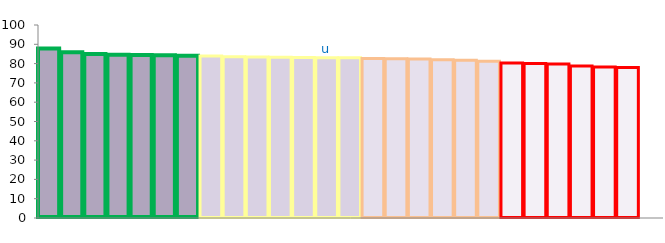
| Category | Top Quartile | 2nd Quartile | 3rd Quartile | Bottom Quartile | Series 4 |
|---|---|---|---|---|---|
|  | 87.875 | 0 | 0 | 0 | 87.875 |
|  | 85.885 | 0 | 0 | 0 | 85.885 |
|  | 84.966 | 0 | 0 | 0 | 84.966 |
|  | 84.547 | 0 | 0 | 0 | 84.547 |
|  | 84.412 | 0 | 0 | 0 | 84.412 |
|  | 84.321 | 0 | 0 | 0 | 84.321 |
|  | 84.086 | 0 | 0 | 0 | 84.086 |
|  | 0 | 83.964 | 0 | 0 | 83.964 |
|  | 0 | 83.531 | 0 | 0 | 83.531 |
|  | 0 | 83.359 | 0 | 0 | 83.359 |
|  | 0 | 83.236 | 0 | 0 | 83.236 |
|  | 0 | 83.097 | 0 | 0 | 83.097 |
| u | 0 | 83.003 | 0 | 0 | 83.003 |